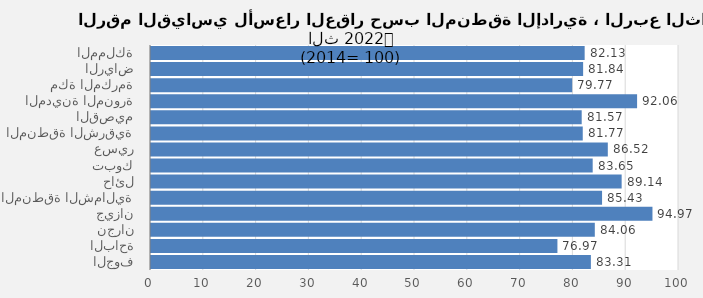
| Category | 2022 |
|---|---|
| المملكة | 82.132 |
| الرياض | 81.842 |
| مكة المكرمة | 79.772 |
| المدينة المنورة | 92.063 |
| القصيم | 81.574 |
| المنطقة الشرقية | 81.772 |
| عسير | 86.517 |
| تبوك | 83.653 |
| حائل | 89.138 |
| المنطقة الشمالية | 85.429 |
| جيزان | 94.974 |
| نجران | 84.055 |
| الباحة | 76.974 |
| الجوف | 83.311 |